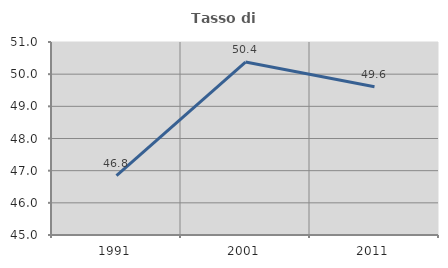
| Category | Tasso di occupazione   |
|---|---|
| 1991.0 | 46.846 |
| 2001.0 | 50.378 |
| 2011.0 | 49.606 |